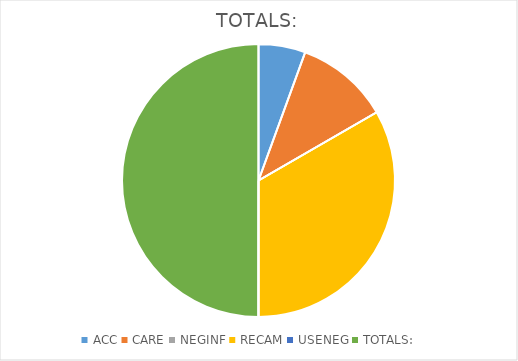
| Category | TOTALS: |
|---|---|
| ACC | 1 |
| CARE | 2 |
| NEGINF | 0 |
| RECAM | 6 |
| USENEG | 0 |
| TOTALS: | 9 |